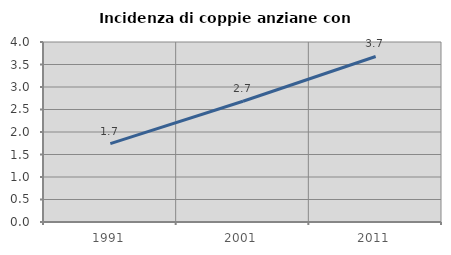
| Category | Incidenza di coppie anziane con figli |
|---|---|
| 1991.0 | 1.74 |
| 2001.0 | 2.683 |
| 2011.0 | 3.678 |